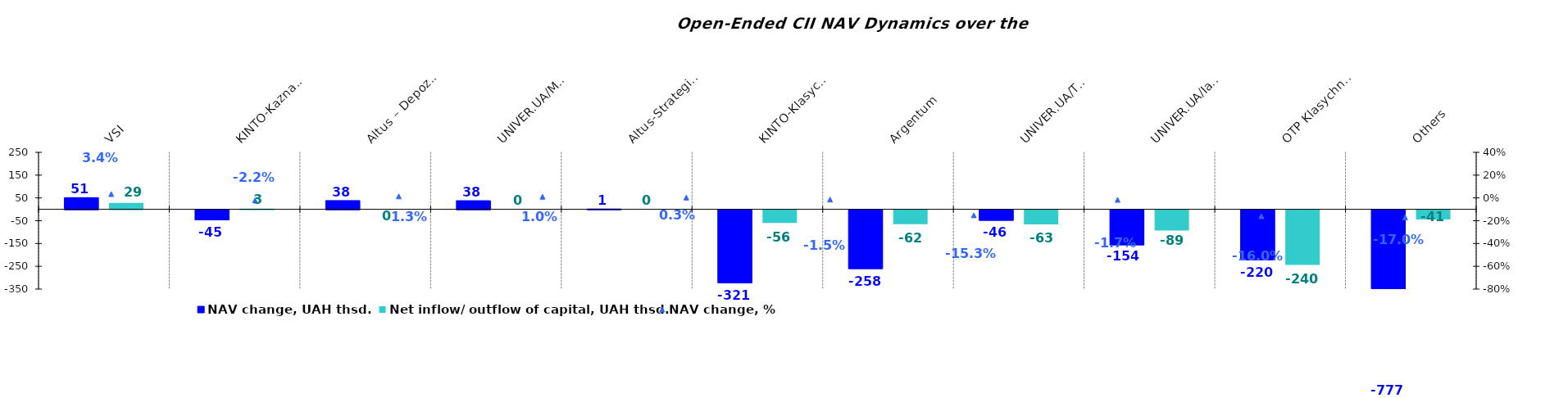
| Category | NAV change, UAH thsd. | Net inflow/ outflow of capital, UAH thsd. |
|---|---|---|
| VSI | 51.21 | 28.56 |
| KINTO-Kaznacheyskyi | -44.576 | 2.96 |
| Altus – Depozyt | 38.333 | 0 |
| UNIVER.UA/Myhailo Grushevskyi: Fond Derzhavnyh Paperiv    | 37.796 | 0 |
| Altus-Strategichnyi | 1.37 | 0 |
| KINTO-Klasychnyi | -320.679 | -55.963 |
| Argentum | -258.472 | -61.927 |
| UNIVER.UA/Taras Shevchenko: Fond Zaoshchadzhen | -46.375 | -62.801 |
| UNIVER.UA/Iaroslav Mudryi: Fond Aktsii | -154.022 | -89.283 |
| OTP Klasychnyi  | -219.808 | -240.332 |
| Others | -776.505 | -41.012 |